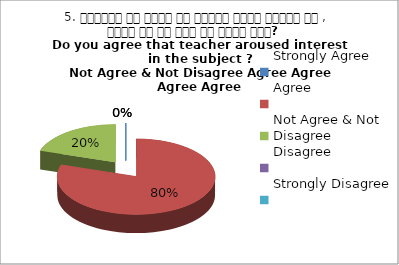
| Category | 5. शिक्षक ने विषय के प्रति रूचि जागृत की , क्या आप इस बात से सहमत हैं?  
Do you agree that teacher aroused interest in the subject ?
 Not Agree & Not Disagree Agree Agree Agree Agree |
|---|---|
| Strongly Agree | 0 |
| Agree | 4 |
| Not Agree & Not Disagree | 1 |
| Disagree | 0 |
| Strongly Disagree | 0 |